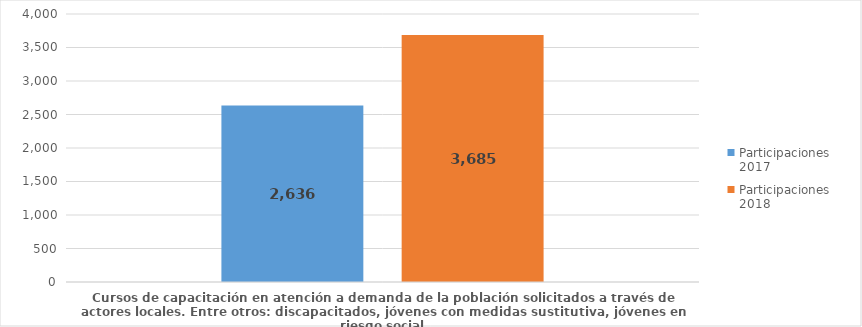
| Category | Participaciones 2017 | Participaciones 
2018 |
|---|---|---|
| Cursos de capacitación en atención a demanda de la población solicitados a través de actores locales. Entre otros: discapacitados, jóvenes con medidas sustitutiva, jóvenes en riesgo social | 2636 | 3685 |